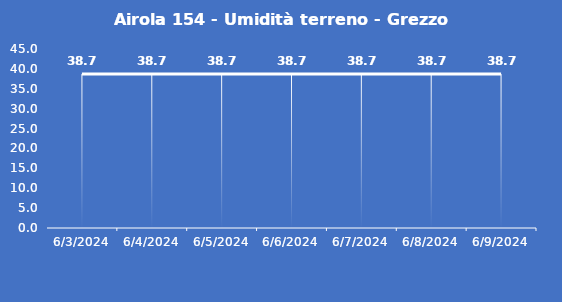
| Category | Airola 154 - Umidità terreno - Grezzo (%VWC) |
|---|---|
| 6/3/24 | 38.7 |
| 6/4/24 | 38.7 |
| 6/5/24 | 38.7 |
| 6/6/24 | 38.7 |
| 6/7/24 | 38.7 |
| 6/8/24 | 38.7 |
| 6/9/24 | 38.7 |